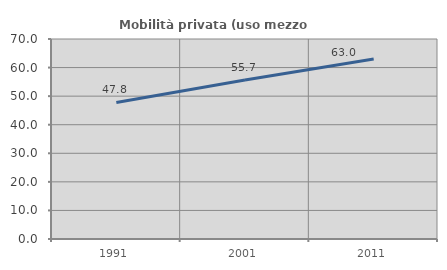
| Category | Mobilità privata (uso mezzo privato) |
|---|---|
| 1991.0 | 47.806 |
| 2001.0 | 55.67 |
| 2011.0 | 62.996 |